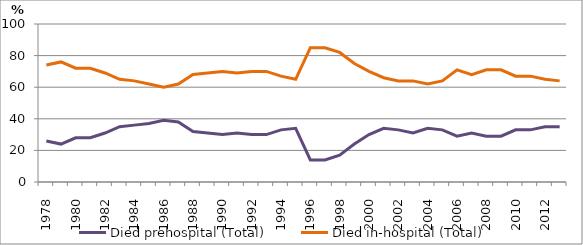
| Category | Died prehospital (Total) | Died in-hospital (Total) |
|---|---|---|
| 1978.0 | 26 | 74 |
| 1979.0 | 24 | 76 |
| 1980.0 | 28 | 72 |
| 1981.0 | 28 | 72 |
| 1982.0 | 31 | 69 |
| 1983.0 | 35 | 65 |
| 1984.0 | 36 | 64 |
| 1985.0 | 37 | 62 |
| 1986.0 | 39 | 60 |
| 1987.0 | 38 | 62 |
| 1988.0 | 32 | 68 |
| 1989.0 | 31 | 69 |
| 1990.0 | 30 | 70 |
| 1991.0 | 31 | 69 |
| 1992.0 | 30 | 70 |
| 1993.0 | 30 | 70 |
| 1994.0 | 33 | 67 |
| 1995.0 | 34 | 65 |
| 1996.0 | 14 | 85 |
| 1997.0 | 14 | 85 |
| 1998.0 | 17 | 82 |
| 1999.0 | 24 | 75 |
| 2000.0 | 30 | 70 |
| 2001.0 | 34 | 66 |
| 2002.0 | 33 | 64 |
| 2003.0 | 31 | 64 |
| 2004.0 | 34 | 62 |
| 2005.0 | 33 | 64 |
| 2006.0 | 29 | 71 |
| 2007.0 | 31 | 68 |
| 2008.0 | 29 | 71 |
| 2009.0 | 29 | 71 |
| 2010.0 | 33 | 67 |
| 2011.0 | 33 | 67 |
| 2012.0 | 35 | 65 |
| 2013.0 | 35 | 64 |